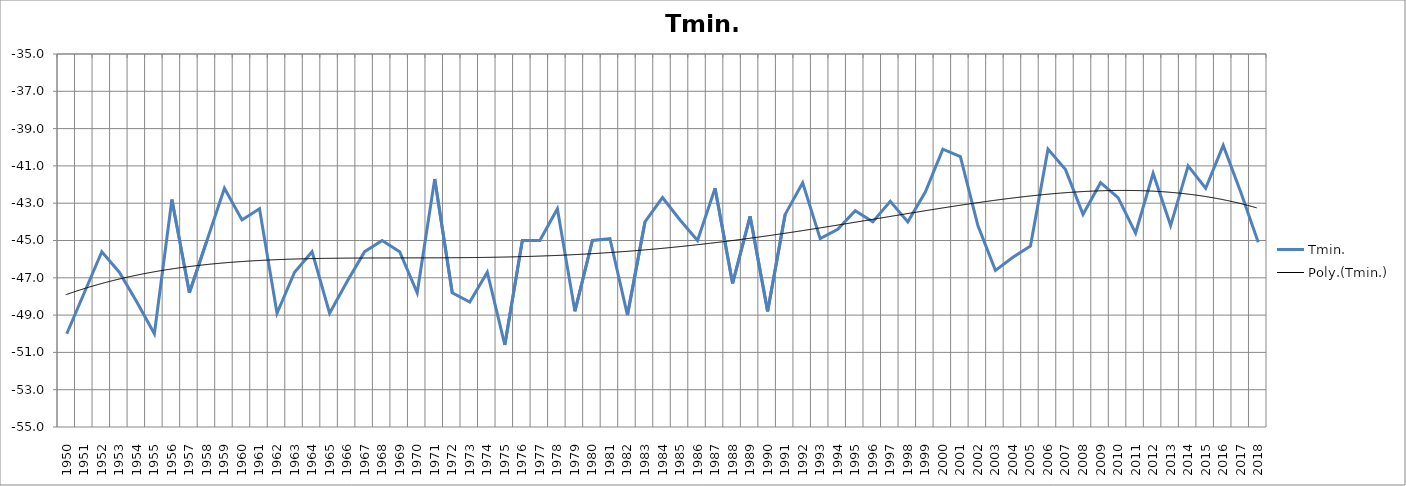
| Category | Tmin. |
|---|---|
| 1950.0 | -50 |
| 1951.0 | -47.8 |
| 1952.0 | -45.6 |
| 1953.0 | -46.7 |
| 1954.0 | -48.3 |
| 1955.0 | -50 |
| 1956.0 | -42.8 |
| 1957.0 | -47.8 |
| 1958.0 | -45 |
| 1959.0 | -42.2 |
| 1960.0 | -43.9 |
| 1961.0 | -43.3 |
| 1962.0 | -48.9 |
| 1963.0 | -46.7 |
| 1964.0 | -45.6 |
| 1965.0 | -48.9 |
| 1966.0 | -47.2 |
| 1967.0 | -45.6 |
| 1968.0 | -45 |
| 1969.0 | -45.6 |
| 1970.0 | -47.8 |
| 1971.0 | -41.7 |
| 1972.0 | -47.8 |
| 1973.0 | -48.3 |
| 1974.0 | -46.7 |
| 1975.0 | -50.6 |
| 1976.0 | -45 |
| 1977.0 | -45 |
| 1978.0 | -43.3 |
| 1979.0 | -48.8 |
| 1980.0 | -45 |
| 1981.0 | -44.9 |
| 1982.0 | -49 |
| 1983.0 | -44 |
| 1984.0 | -42.7 |
| 1985.0 | -43.9 |
| 1986.0 | -45 |
| 1987.0 | -42.2 |
| 1988.0 | -47.3 |
| 1989.0 | -43.7 |
| 1990.0 | -48.8 |
| 1991.0 | -43.6 |
| 1992.0 | -41.9 |
| 1993.0 | -44.9 |
| 1994.0 | -44.4 |
| 1995.0 | -43.4 |
| 1996.0 | -44 |
| 1997.0 | -42.9 |
| 1998.0 | -44 |
| 1999.0 | -42.4 |
| 2000.0 | -40.1 |
| 2001.0 | -40.5 |
| 2002.0 | -44.2 |
| 2003.0 | -46.6 |
| 2004.0 | -45.9 |
| 2005.0 | -45.3 |
| 2006.0 | -40.1 |
| 2007.0 | -41.2 |
| 2008.0 | -43.6 |
| 2009.0 | -41.9 |
| 2010.0 | -42.7 |
| 2011.0 | -44.6 |
| 2012.0 | -41.4 |
| 2013.0 | -44.2 |
| 2014.0 | -41 |
| 2015.0 | -42.2 |
| 2016.0 | -39.9 |
| 2017.0 | -42.4 |
| 2018.0 | -45.1 |